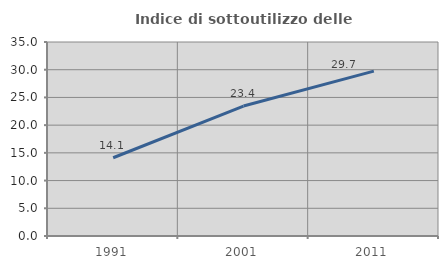
| Category | Indice di sottoutilizzo delle abitazioni  |
|---|---|
| 1991.0 | 14.118 |
| 2001.0 | 23.448 |
| 2011.0 | 29.747 |